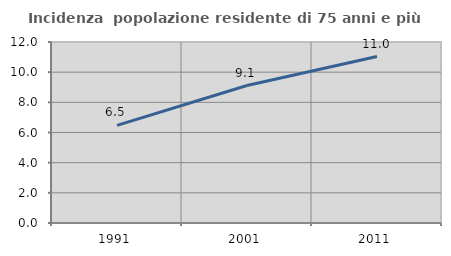
| Category | Incidenza  popolazione residente di 75 anni e più |
|---|---|
| 1991.0 | 6.474 |
| 2001.0 | 9.113 |
| 2011.0 | 11.037 |